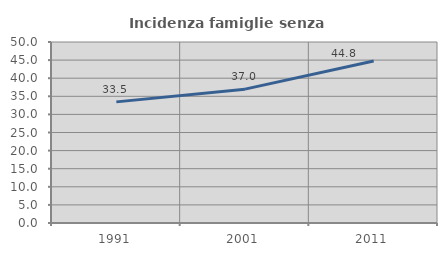
| Category | Incidenza famiglie senza nuclei |
|---|---|
| 1991.0 | 33.462 |
| 2001.0 | 36.975 |
| 2011.0 | 44.776 |